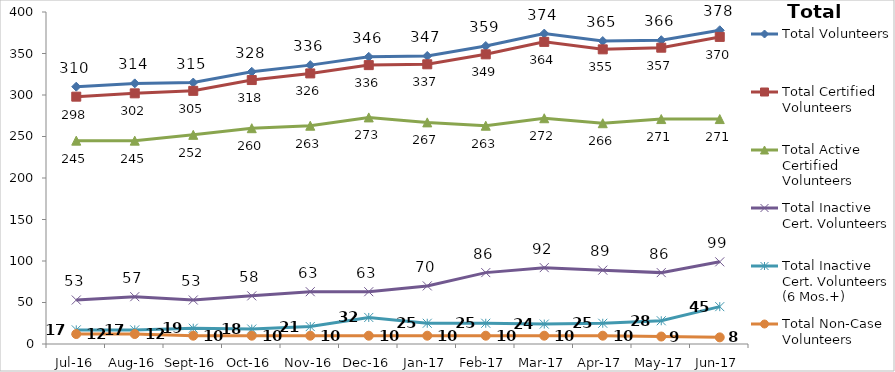
| Category | Total Volunteers | Total Certified Volunteers | Total Active Certified Volunteers | Total Inactive Cert. Volunteers | Total Inactive Cert. Volunteers (6 Mos.+) | Total Non-Case Volunteers |
|---|---|---|---|---|---|---|
| Jul-16 | 310 | 298 | 245 | 53 | 17 | 12 |
| Aug-16 | 314 | 302 | 245 | 57 | 17 | 12 |
| Sep-16 | 315 | 305 | 252 | 53 | 19 | 10 |
| Oct-16 | 328 | 318 | 260 | 58 | 18 | 10 |
| Nov-16 | 336 | 326 | 263 | 63 | 21 | 10 |
| Dec-16 | 346 | 336 | 273 | 63 | 32 | 10 |
| Jan-17 | 347 | 337 | 267 | 70 | 25 | 10 |
| Feb-17 | 359 | 349 | 263 | 86 | 25 | 10 |
| Mar-17 | 374 | 364 | 272 | 92 | 24 | 10 |
| Apr-17 | 365 | 355 | 266 | 89 | 25 | 10 |
| May-17 | 366 | 357 | 271 | 86 | 28 | 9 |
| Jun-17 | 378 | 370 | 271 | 99 | 45 | 8 |